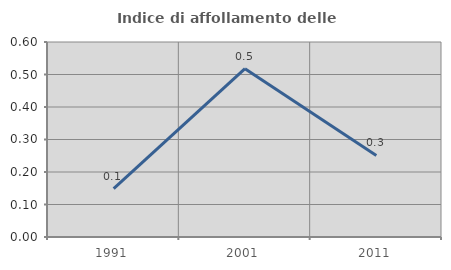
| Category | Indice di affollamento delle abitazioni  |
|---|---|
| 1991.0 | 0.149 |
| 2001.0 | 0.518 |
| 2011.0 | 0.251 |